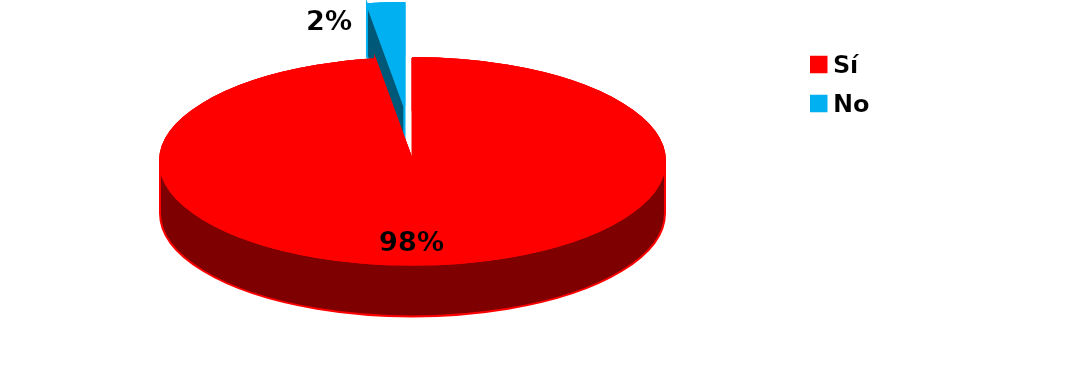
| Category | Series 0 |
|---|---|
| Sí | 124 |
| No | 3 |